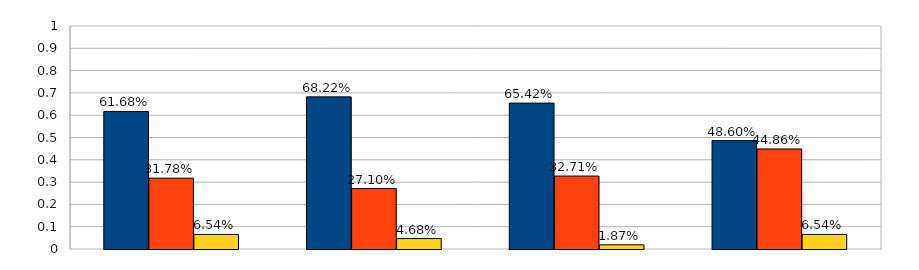
| Category | Хорошо | Удовлетворительно | Неудовлетворительно |
|---|---|---|---|
| 0 | 0.617 | 0.318 | 0.065 |
| 1 | 0.682 | 0.271 | 0.047 |
| 2 | 0.654 | 0.327 | 0.019 |
| 3 | 0.486 | 0.449 | 0.065 |